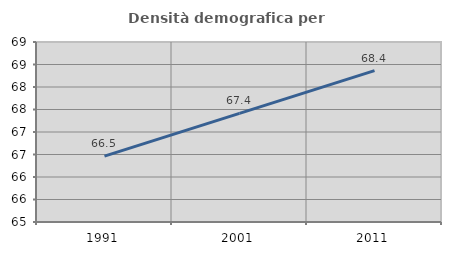
| Category | Densità demografica |
|---|---|
| 1991.0 | 66.465 |
| 2001.0 | 67.414 |
| 2011.0 | 68.364 |